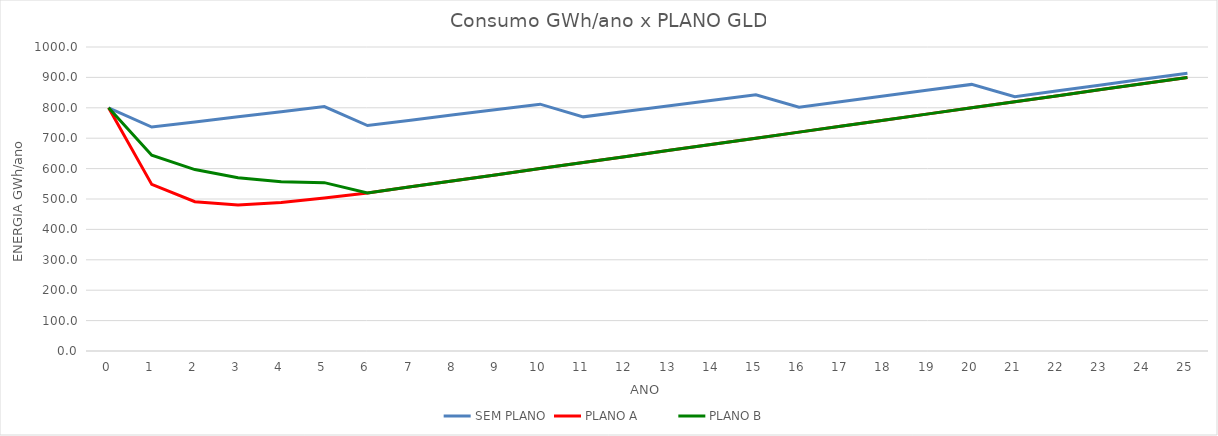
| Category | SEM PLANO | PLANO A | PLANO B |
|---|---|---|---|
| 0.0 | 800 | 800 | 800 |
| 1.0 | 736.8 | 548 | 644 |
| 2.0 | 753.6 | 491.2 | 596.8 |
| 3.0 | 770.4 | 480.48 | 569.76 |
| 4.0 | 787.2 | 488.192 | 556.832 |
| 5.0 | 804 | 503.277 | 553.782 |
| 6.0 | 741.6 | 520 | 520 |
| 7.0 | 759.2 | 540 | 540 |
| 8.0 | 776.8 | 560 | 560 |
| 9.0 | 794.4 | 580 | 580 |
| 10.0 | 812 | 600 | 600 |
| 11.0 | 770.2 | 620 | 620 |
| 12.0 | 788.4 | 640 | 640 |
| 13.0 | 806.6 | 660 | 660 |
| 14.0 | 824.8 | 680 | 680 |
| 15.0 | 843 | 700 | 700 |
| 16.0 | 801.8 | 720 | 720 |
| 17.0 | 820.6 | 740 | 740 |
| 18.0 | 839.4 | 760 | 760 |
| 19.0 | 858.2 | 780 | 780 |
| 20.0 | 877 | 800 | 800 |
| 21.0 | 836.4 | 820 | 820 |
| 22.0 | 855.8 | 840 | 840 |
| 23.0 | 875.2 | 860 | 860 |
| 24.0 | 894.6 | 880 | 880 |
| 25.0 | 914 | 900 | 900 |